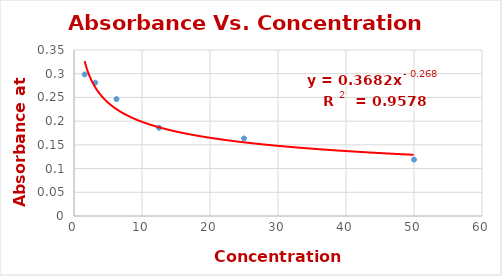
| Category | Series 0 |
|---|---|
| 50.0 | 0.119 |
| 25.0 | 0.163 |
| 12.5 | 0.186 |
| 6.25 | 0.246 |
| 3.125 | 0.281 |
| 1.5625 | 0.298 |